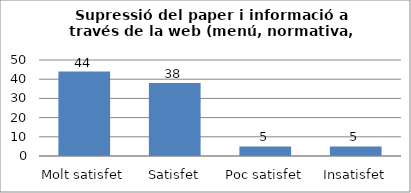
| Category | Series 0 |
|---|---|
| Molt satisfet | 44 |
| Satisfet | 38 |
| Poc satisfet | 5 |
| Insatisfet | 5 |